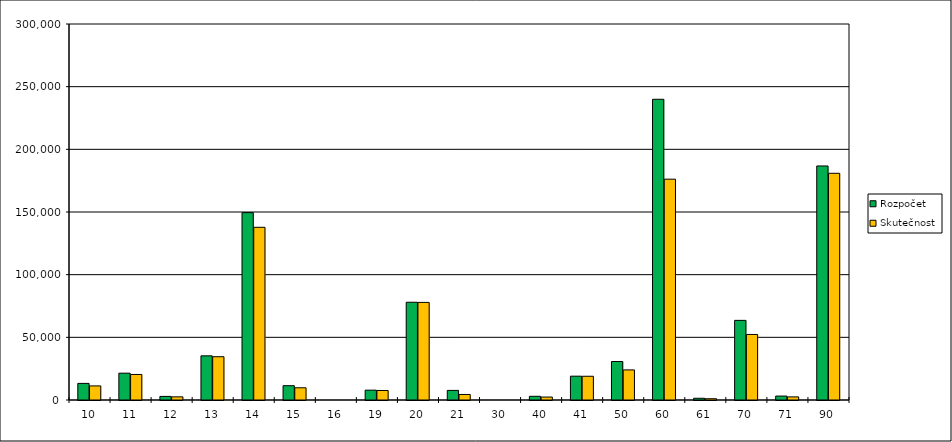
| Category | Rozpočet | Skutečnost |
|---|---|---|
| 10.0 | 13240.7 | 11244.31 |
| 11.0 | 21398.11 | 20369.78 |
| 12.0 | 2863.59 | 2514.04 |
| 13.0 | 35235.6 | 34542.41 |
| 14.0 | 149470.57 | 137794.62 |
| 15.0 | 11414.4 | 9739.56 |
| 16.0 | 0 | 0 |
| 19.0 | 7851.37 | 7588.23 |
| 20.0 | 77990.48 | 77868.46 |
| 21.0 | 7656.68 | 4411.01 |
| 30.0 | 0 | 0 |
| 40.0 | 2949.74 | 2355.14 |
| 41.0 | 18999.7 | 18945.88 |
| 50.0 | 30699.57 | 24001.24 |
| 60.0 | 239936.68 | 176181.44 |
| 61.0 | 1379.51 | 1017.3 |
| 70.0 | 63534.3 | 52293.42 |
| 71.0 | 3129.74 | 2472.75 |
| 90.0 | 186738.03 | 180883.63 |